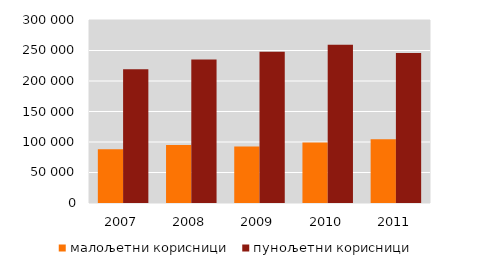
| Category | малољетни корисници | пунољетни корисници |
|---|---|---|
| 2007.0 | 87925 | 219388 |
| 2008.0 | 95267 | 235275 |
| 2009.0 | 92419 | 248132 |
| 2010.0 | 99335 | 259328 |
| 2011.0 | 104615 | 245929 |